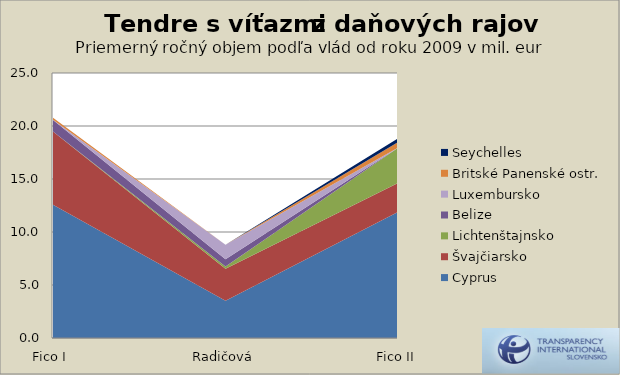
| Category | Cyprus | Švajčiarsko | Lichtenštajnsko | Belize | Luxembursko | Britské Panenské ostr. | Seychelles |
|---|---|---|---|---|---|---|---|
| Fico I | 12.563 | 6.908 | 0 | 1.101 | 0.018 | 0.178 | 0 |
| Radičová | 3.519 | 3.023 | 0.201 | 0.677 | 1.371 | 0 | 0.013 |
| Fico II | 11.894 | 2.717 | 3.324 | 0 | 0.013 | 0.523 | 0.355 |